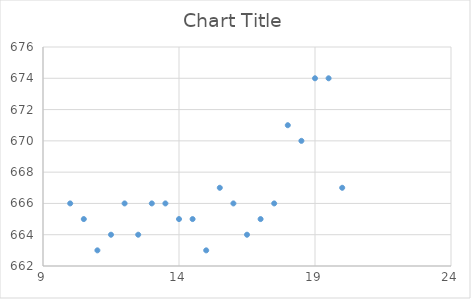
| Category | Series 0 |
|---|---|
| 20.0 | 667 |
| 19.5 | 674 |
| 19.0 | 674 |
| 18.5 | 670 |
| 18.0 | 671 |
| 17.5 | 666 |
| 17.0 | 665 |
| 16.5 | 664 |
| 16.0 | 666 |
| 15.5 | 667 |
| 15.0 | 663 |
| 14.5 | 665 |
| 14.0 | 665 |
| 13.5 | 666 |
| 13.0 | 666 |
| 12.5 | 664 |
| 12.0 | 666 |
| 11.5 | 664 |
| 11.0 | 663 |
| 10.5 | 665 |
| 10.0 | 666 |